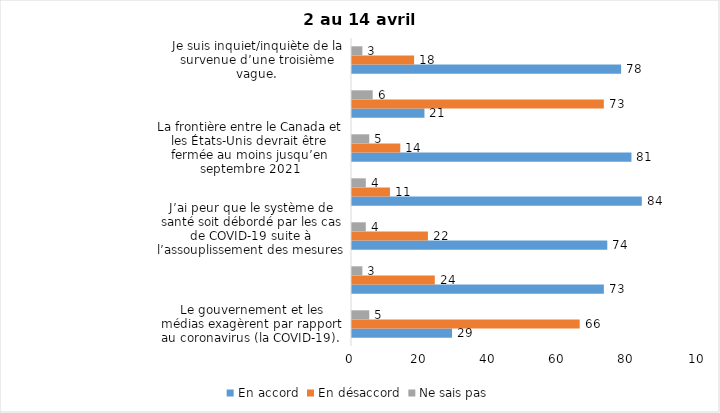
| Category | En accord | En désaccord | Ne sais pas |
|---|---|---|---|
| Le gouvernement et les médias exagèrent par rapport au coronavirus (la COVID-19). | 29 | 66 | 5 |
| Je suis favorable au maintien du couvre-feu pour les prochaines semaines. | 73 | 24 | 3 |
| J’ai peur que le système de santé soit débordé par les cas de COVID-19 suite à l’assouplissement des mesures | 74 | 22 | 4 |
| Je suis inquiet/inquiète  que le nombre de cas augmente en raison des nouveaux variants du virus de la COVID-19 | 84 | 11 | 4 |
| La frontière entre le Canada et les États-Unis devrait être fermée au moins jusqu’en septembre 2021 | 81 | 14 | 5 |
| Les personnes vaccinées contre la COVID-19 devraient avoir le droit de faire des rassemblements privés et de ne plus porter le masque dans les lieux publics. | 21 | 73 | 6 |
| Je suis inquiet/inquiète de la survenue d’une troisième vague. | 78 | 18 | 3 |